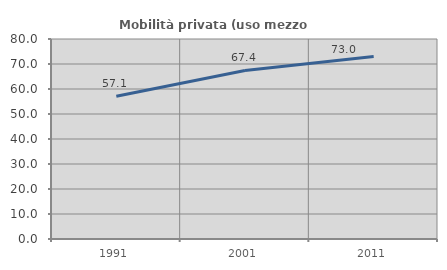
| Category | Mobilità privata (uso mezzo privato) |
|---|---|
| 1991.0 | 57.086 |
| 2001.0 | 67.402 |
| 2011.0 | 73.026 |